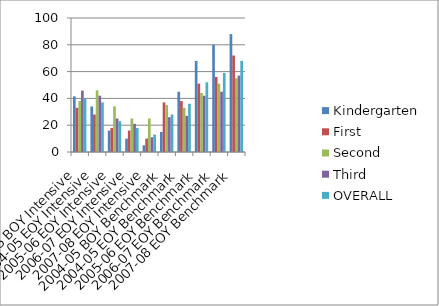
| Category | Kindergarten | First | Second | Third | OVERALL |
|---|---|---|---|---|---|
| 2004-05 BOY Intensive | 41.525 | 33 | 38 | 45.841 | 40 |
| 2004-05 EOY Intensive | 34 | 28 | 46 | 42 | 37 |
| 2005-06 EOY Intensive | 16 | 18 | 34 | 25 | 23 |
| 2006-07 EOY Intensive | 10 | 16 | 25 | 21 | 18 |
| 2007-08 EOY Intensive | 5 | 10 | 25 | 11 | 13 |
| 2004-05 BOY Benchmark | 15 | 37 | 35 | 26 | 28 |
| 2004-05 EOY Benchmark | 45 | 38 | 33 | 27 | 36 |
| 2005-06 EOY Benchmark | 68 | 51 | 44 | 42 | 52 |
| 2006-07 EOY Benchmark | 80 | 56 | 51 | 45 | 59 |
| 2007-08 EOY Benchmark | 88 | 72 | 55 | 57 | 68 |